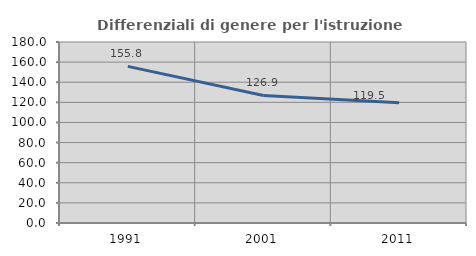
| Category | Differenziali di genere per l'istruzione superiore |
|---|---|
| 1991.0 | 155.779 |
| 2001.0 | 126.874 |
| 2011.0 | 119.537 |